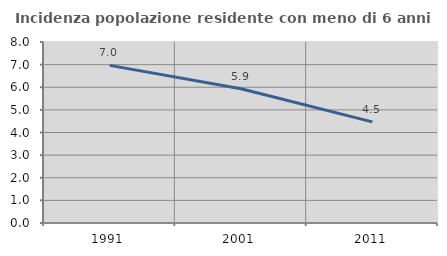
| Category | Incidenza popolazione residente con meno di 6 anni |
|---|---|
| 1991.0 | 6.967 |
| 2001.0 | 5.932 |
| 2011.0 | 4.469 |